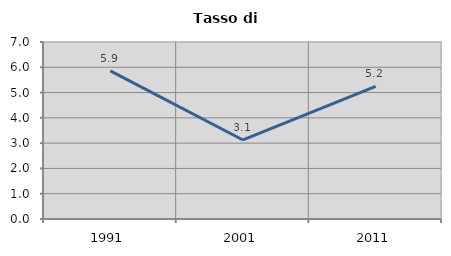
| Category | Tasso di disoccupazione   |
|---|---|
| 1991.0 | 5.861 |
| 2001.0 | 3.125 |
| 2011.0 | 5.246 |